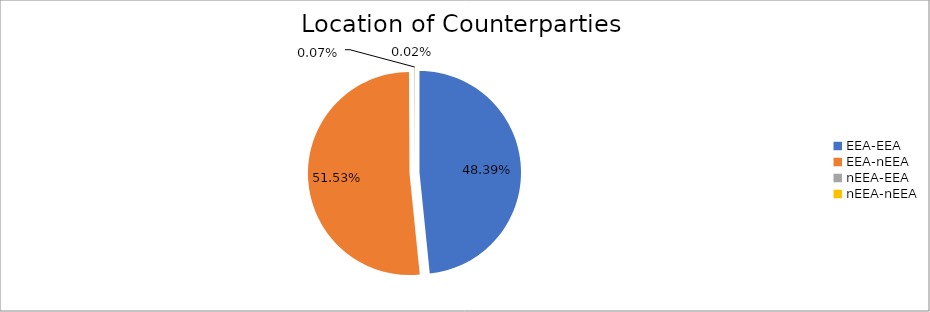
| Category | Series 0 |
|---|---|
| EEA-EEA | 6770090.068 |
| EEA-nEEA | 7209387.238 |
| nEEA-EEA | 9963.732 |
| nEEA-nEEA | 2444.716 |